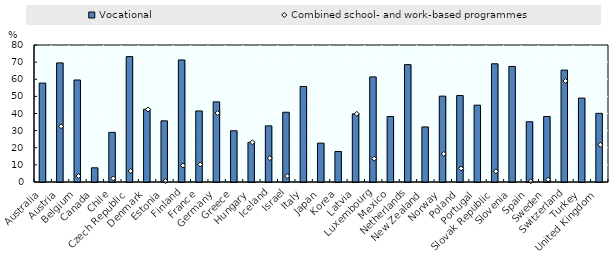
| Category | Vocational |
|---|---|
| Australia | 57.76 |
| Austria | 69.548 |
| Belgium | 59.559 |
| Canada | 8.277 |
| Chile | 28.979 |
| Czech Republic | 73.214 |
| Denmark | 42.482 |
| Estonia | 35.72 |
| Finland | 71.269 |
| France | 41.487 |
| Germany | 46.795 |
| Greece | 29.911 |
| Hungary | 23.181 |
| Iceland | 32.779 |
| Israel | 40.731 |
| Italy | 55.792 |
| Japan | 22.695 |
| Korea | 17.816 |
| Latvia | 39.8 |
| Luxembourg | 61.363 |
| Mexico | 38.224 |
| Netherlands | 68.539 |
| New Zealand | 32.152 |
| Norway | 50.139 |
| Poland | 50.499 |
| Portugal | 44.859 |
| Slovak Republic | 69.027 |
| Slovenia | 67.472 |
| Spain | 35.191 |
| Sweden | 38.237 |
| Switzerland | 65.331 |
| Turkey | 48.991 |
| United Kingdom | 40.088 |